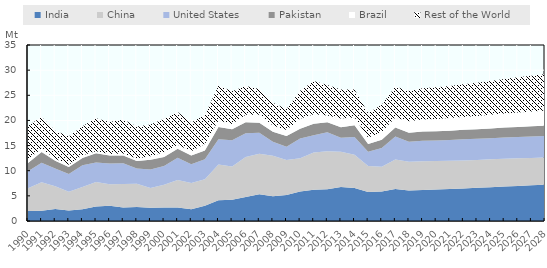
| Category | India | China | United States | Pakistan | Brazil | Rest of the World |
|---|---|---|---|---|---|---|
| 1990.0 | 1.989 | 4.508 | 3.376 | 1.638 | 0.717 | 6.723 |
| 1991.0 | 2.053 | 5.672 | 3.835 | 2.18 | 0.667 | 6.27 |
| 1992.0 | 2.38 | 4.51 | 3.531 | 1.539 | 0.42 | 5.563 |
| 1993.0 | 2.095 | 3.739 | 3.513 | 1.367 | 0.484 | 5.665 |
| 1994.0 | 2.354 | 4.428 | 4.281 | 1.478 | 0.537 | 5.763 |
| 1995.0 | 2.885 | 4.865 | 3.897 | 1.801 | 0.41 | 6.557 |
| 1996.0 | 3.024 | 4.286 | 4.124 | 1.594 | 0.306 | 6.366 |
| 1997.0 | 2.686 | 4.695 | 4.092 | 1.561 | 0.412 | 6.735 |
| 1998.0 | 2.805 | 4.59 | 3.03 | 1.494 | 0.521 | 6.371 |
| 1999.0 | 2.652 | 3.904 | 3.694 | 1.911 | 0.7 | 6.332 |
| 2000.0 | 2.686 | 4.505 | 3.742 | 1.783 | 0.939 | 6.655 |
| 2001.0 | 2.686 | 5.487 | 4.42 | 1.783 | 0.766 | 6.543 |
| 2002.0 | 2.36 | 5.193 | 3.747 | 1.736 | 0.848 | 5.698 |
| 2003.0 | 3.043 | 5.276 | 3.975 | 1.708 | 1.309 | 5.782 |
| 2004.0 | 4.131 | 7.085 | 5.062 | 2.425 | 1.299 | 6.951 |
| 2005.0 | 4.237 | 6.616 | 5.201 | 2.213 | 1.038 | 6.483 |
| 2006.0 | 4.76 | 7.975 | 4.7 | 2.186 | 1.524 | 5.694 |
| 2007.0 | 5.314 | 8.071 | 4.182 | 1.981 | 1.602 | 5.119 |
| 2008.0 | 4.93 | 8.025 | 2.79 | 2.009 | 1.214 | 4.542 |
| 2009.0 | 5.185 | 6.925 | 2.654 | 2.158 | 1.194 | 4.177 |
| 2010.0 | 5.865 | 6.6 | 3.942 | 1.948 | 1.96 | 5.576 |
| 2011.0 | 6.239 | 7.4 | 3.391 | 2.311 | 1.893 | 6.613 |
| 2012.0 | 6.29 | 7.6 | 3.77 | 2.002 | 1.31 | 6.077 |
| 2013.0 | 6.766 | 7 | 2.811 | 2.076 | 1.734 | 5.777 |
| 2014.0 | 6.562 | 6.6 | 3.553 | 2.305 | 1.563 | 5.59 |
| 2015.0 | 5.746 | 5.2 | 2.806 | 1.537 | 1.289 | 4.91 |
| 2016.0 | 5.865 | 4.9 | 3.738 | 1.663 | 1.53 | 5.402 |
| 2017.0 | 6.35 | 5.89 | 4.555 | 1.795 | 2.006 | 6.146 |
| 2018.0 | 6.05 | 5.724 | 4.006 | 1.75 | 2.307 | 6.006 |
| 2019.0 | 6.159 | 5.706 | 4.099 | 1.834 | 2.376 | 6.233 |
| 2020.0 | 6.26 | 5.652 | 4.1 | 1.844 | 2.44 | 6.299 |
| 2021.0 | 6.366 | 5.599 | 4.134 | 1.862 | 2.5 | 6.379 |
| 2022.0 | 6.483 | 5.564 | 4.191 | 1.886 | 2.566 | 6.485 |
| 2023.0 | 6.602 | 5.544 | 4.204 | 1.915 | 2.636 | 6.612 |
| 2024.0 | 6.724 | 5.533 | 4.21 | 1.944 | 2.708 | 6.744 |
| 2025.0 | 6.846 | 5.52 | 4.235 | 1.974 | 2.785 | 6.874 |
| 2026.0 | 6.966 | 5.493 | 4.252 | 2.002 | 2.856 | 6.996 |
| 2027.0 | 7.087 | 5.456 | 4.263 | 2.031 | 2.925 | 7.117 |
| 2028.0 | 7.212 | 5.416 | 4.271 | 2.06 | 2.992 | 7.238 |